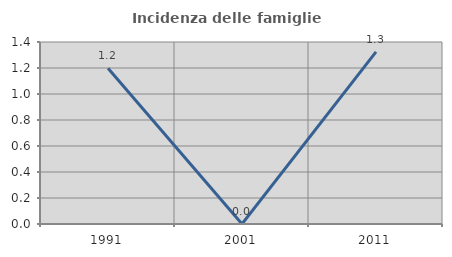
| Category | Incidenza delle famiglie numerose |
|---|---|
| 1991.0 | 1.198 |
| 2001.0 | 0 |
| 2011.0 | 1.325 |